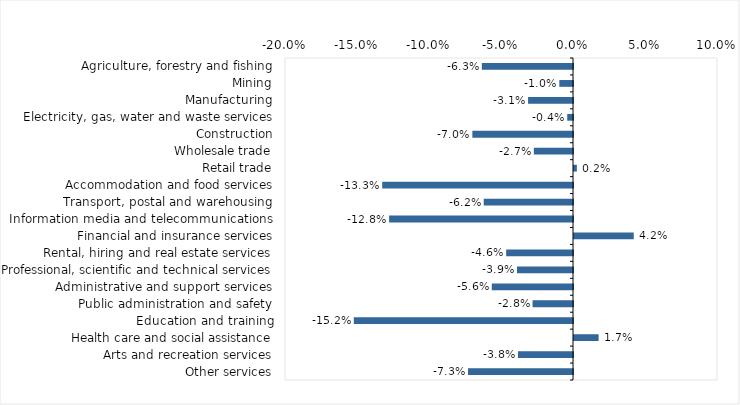
| Category | This week |
|---|---|
| Agriculture, forestry and fishing | -0.063 |
| Mining | -0.01 |
| Manufacturing | -0.031 |
| Electricity, gas, water and waste services | -0.004 |
| Construction | -0.07 |
| Wholesale trade | -0.027 |
| Retail trade | 0.002 |
| Accommodation and food services | -0.132 |
| Transport, postal and warehousing | -0.062 |
| Information media and telecommunications | -0.128 |
| Financial and insurance services | 0.042 |
| Rental, hiring and real estate services | -0.046 |
| Professional, scientific and technical services | -0.039 |
| Administrative and support services | -0.056 |
| Public administration and safety | -0.028 |
| Education and training | -0.152 |
| Health care and social assistance | 0.017 |
| Arts and recreation services | -0.038 |
| Other services | -0.073 |